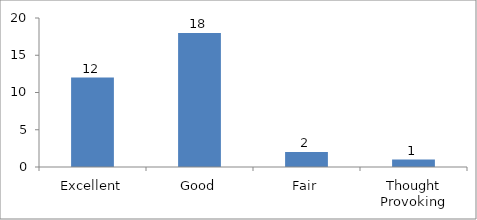
| Category | How would you rate this session or workshop? |
|---|---|
| Excellent | 12 |
| Good | 18 |
| Fair | 2 |
| Thought Provoking | 1 |